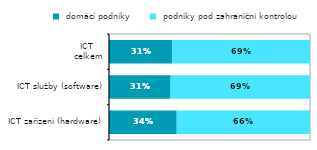
| Category |  domácí podniky |  podniky pod zahraniční kontrolou |
|---|---|---|
|   ICT zařízení (hardware) | 0.337 | 0.663 |
|   ICT služby (software) | 0.306 | 0.694 |
| ICT 
celkem | 0.314 | 0.686 |